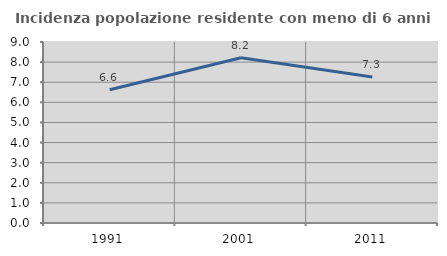
| Category | Incidenza popolazione residente con meno di 6 anni |
|---|---|
| 1991.0 | 6.628 |
| 2001.0 | 8.217 |
| 2011.0 | 7.265 |